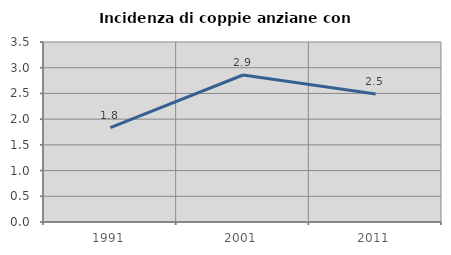
| Category | Incidenza di coppie anziane con figli |
|---|---|
| 1991.0 | 1.835 |
| 2001.0 | 2.858 |
| 2011.0 | 2.489 |